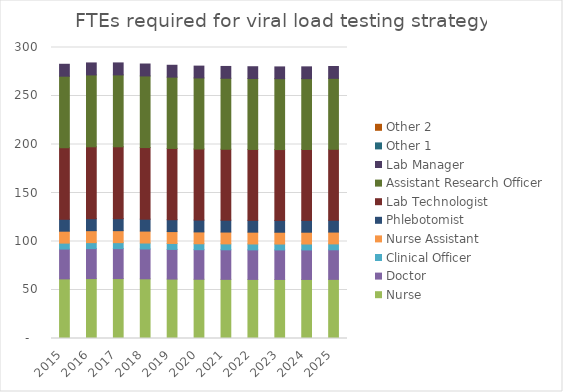
| Category | Nurse   | Doctor | Clinical Officer | Nurse Assistant  | Phlebotomist | Lab Technologist | Assistant Research Officer | Lab Manager | Other 1 | Other 2 |
|---|---|---|---|---|---|---|---|---|---|---|
| 2015.0 | 61.458 | 30.729 | 6.146 | 12.292 | 12.292 | 73.75 | 73.75 | 12.292 | 0 | 0 |
| 2016.0 | 61.759 | 30.88 | 6.176 | 12.352 | 12.352 | 74.111 | 74.111 | 12.352 | 0 | 0 |
| 2017.0 | 61.764 | 30.882 | 6.176 | 12.353 | 12.353 | 74.116 | 74.116 | 12.353 | 0 | 0 |
| 2018.0 | 61.517 | 30.759 | 6.152 | 12.303 | 12.303 | 73.821 | 73.821 | 12.303 | 0 | 0 |
| 2019.0 | 61.235 | 30.617 | 6.123 | 12.247 | 12.247 | 73.482 | 73.482 | 12.247 | 0 | 0 |
| 2020.0 | 61.045 | 30.523 | 6.105 | 12.209 | 12.209 | 73.254 | 73.254 | 12.209 | 0 | 0 |
| 2021.0 | 60.97 | 30.485 | 6.097 | 12.194 | 12.194 | 73.164 | 73.164 | 12.194 | 0 | 0 |
| 2022.0 | 60.907 | 30.454 | 6.091 | 12.181 | 12.181 | 73.089 | 73.089 | 12.181 | 0 | 0 |
| 2023.0 | 60.868 | 30.434 | 6.087 | 12.174 | 12.174 | 73.042 | 73.042 | 12.174 | 0 | 0 |
| 2024.0 | 60.88 | 30.44 | 6.088 | 12.176 | 12.176 | 73.056 | 73.056 | 12.176 | 0 | 0 |
| 2025.0 | 60.956 | 30.478 | 6.096 | 12.191 | 12.191 | 73.147 | 73.147 | 12.191 | 0 | 0 |